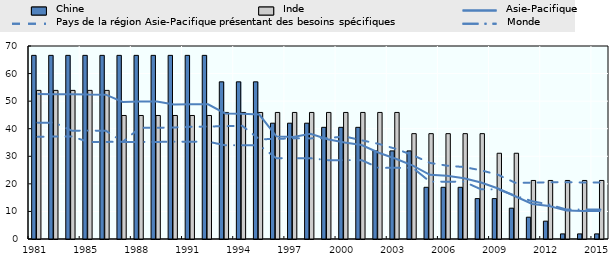
| Category | Chine | Inde |
|---|---|---|
| 1981.0 | 66.6 | 53.9 |
| 1983.0 | 66.6 | 53.9 |
| 1984.0 | 66.6 | 53.9 |
| 1985.0 | 66.6 | 53.9 |
| 1986.0 | 66.6 | 53.9 |
| 1987.0 | 66.6 | 44.8 |
| 1988.0 | 66.6 | 44.8 |
| 1989.0 | 66.6 | 44.8 |
| 1990.0 | 66.6 | 44.8 |
| 1991.0 | 66.6 | 44.8 |
| 1992.0 | 66.6 | 44.8 |
| 1993.0 | 57 | 45.9 |
| 1994.0 | 57 | 45.9 |
| 1995.0 | 57 | 45.9 |
| 1996.0 | 42 | 45.9 |
| 1997.0 | 42 | 45.9 |
| 1998.0 | 42 | 45.9 |
| 1999.0 | 40.5 | 45.9 |
| 2000.0 | 40.5 | 45.9 |
| 2001.0 | 40.5 | 45.9 |
| 2002.0 | 31.95 | 45.9 |
| 2003.0 | 31.95 | 45.9 |
| 2004.0 | 31.95 | 38.21 |
| 2005.0 | 18.75 | 38.21 |
| 2006.0 | 18.75 | 38.21 |
| 2007.0 | 18.75 | 38.21 |
| 2008.0 | 14.65 | 38.21 |
| 2009.0 | 14.65 | 31.1 |
| 2010.0 | 11.18 | 31.1 |
| 2011.0 | 7.9 | 21.23 |
| 2012.0 | 6.47 | 21.23 |
| 2013.0 | 1.85 | 21.23 |
| 2014.0 | 1.85 | 21.23 |
| 2015.0 | 1.85 | 21.23 |